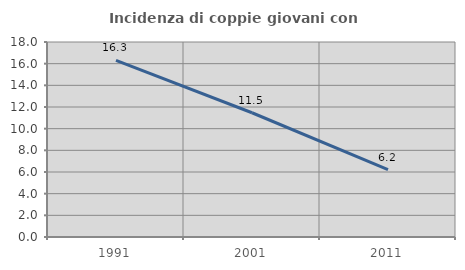
| Category | Incidenza di coppie giovani con figli |
|---|---|
| 1991.0 | 16.3 |
| 2001.0 | 11.47 |
| 2011.0 | 6.228 |